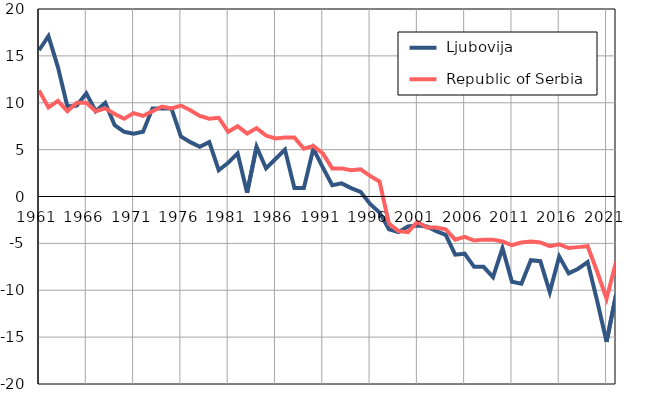
| Category |  Ljubovija |  Republic of Serbia |
|---|---|---|
| 1961.0 | 15.6 | 11.3 |
| 1962.0 | 17.1 | 9.5 |
| 1963.0 | 13.8 | 10.2 |
| 1964.0 | 9.6 | 9.1 |
| 1965.0 | 9.7 | 10 |
| 1966.0 | 11 | 10 |
| 1967.0 | 9.1 | 9.1 |
| 1968.0 | 10 | 9.4 |
| 1969.0 | 7.6 | 8.8 |
| 1970.0 | 6.9 | 8.3 |
| 1971.0 | 6.7 | 8.9 |
| 1972.0 | 6.9 | 8.6 |
| 1973.0 | 9.4 | 9.1 |
| 1974.0 | 9.4 | 9.6 |
| 1975.0 | 9.4 | 9.4 |
| 1976.0 | 6.4 | 9.7 |
| 1977.0 | 5.8 | 9.2 |
| 1978.0 | 5.3 | 8.6 |
| 1979.0 | 5.8 | 8.3 |
| 1980.0 | 2.8 | 8.4 |
| 1981.0 | 3.6 | 6.9 |
| 1982.0 | 4.6 | 7.5 |
| 1983.0 | 0.4 | 6.7 |
| 1984.0 | 5.3 | 7.3 |
| 1985.0 | 3 | 6.5 |
| 1986.0 | 4 | 6.2 |
| 1987.0 | 5 | 6.3 |
| 1988.0 | 0.9 | 6.3 |
| 1989.0 | 0.9 | 5.1 |
| 1990.0 | 5.1 | 5.4 |
| 1991.0 | 3.1 | 4.6 |
| 1992.0 | 1.2 | 3 |
| 1993.0 | 1.4 | 3 |
| 1994.0 | 0.9 | 2.8 |
| 1995.0 | 0.5 | 2.9 |
| 1996.0 | -0.8 | 2.2 |
| 1997.0 | -1.7 | 1.6 |
| 1998.0 | -3.5 | -2.9 |
| 1999.0 | -3.8 | -3.7 |
| 2000.0 | -3.2 | -3.8 |
| 2001.0 | -3.1 | -2.7 |
| 2002.0 | -3.2 | -3.3 |
| 2003.0 | -3.7 | -3.3 |
| 2004.0 | -4.1 | -3.5 |
| 2005.0 | -6.2 | -4.6 |
| 2006.0 | -6.1 | -4.3 |
| 2007.0 | -7.5 | -4.7 |
| 2008.0 | -7.5 | -4.6 |
| 2009.0 | -8.6 | -4.6 |
| 2010.0 | -5.5 | -4.8 |
| 2011.0 | -9.1 | -5.2 |
| 2012.0 | -9.3 | -4.9 |
| 2013.0 | -6.8 | -4.8 |
| 2014.0 | -6.9 | -4.9 |
| 2015.0 | -10.2 | -5.3 |
| 2016.0 | -6.4 | -5.1 |
| 2017.0 | -8.2 | -5.5 |
| 2018.0 | -7.7 | -5.4 |
| 2019.0 | -7 | -5.3 |
| 2020.0 | -11.1 | -8 |
| 2021.0 | -15.5 | -10.9 |
| 2022.0 | -10.5 | -7 |